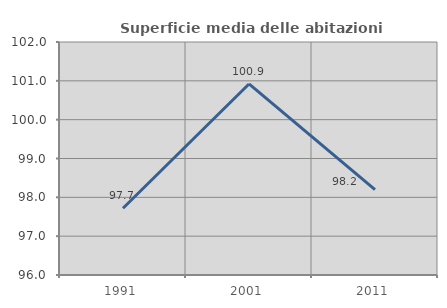
| Category | Superficie media delle abitazioni occupate |
|---|---|
| 1991.0 | 97.719 |
| 2001.0 | 100.919 |
| 2011.0 | 98.197 |